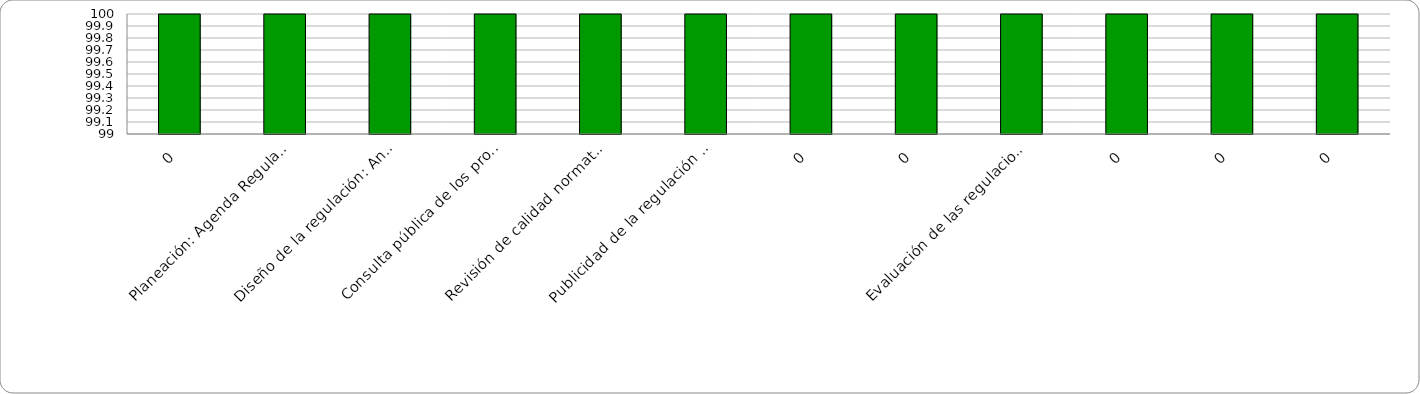
| Category | Niveles |
|---|---|
| 0 | 100 |
| Planeación: Agenda Regulatoria | 100 |
| Diseño de la regulación: Análisis de Impacto Normativo (AIN) | 100 |
| Consulta pública de los proyectos de actos administrativos | 100 |
| Revisión de calidad normativa | 100 |
| Publicidad de la regulación final | 100 |
| 0 | 100 |
| 0 | 100 |
| Evaluación de las regulaciones | 100 |
| 0 | 100 |
| 0 | 100 |
| 0 | 100 |